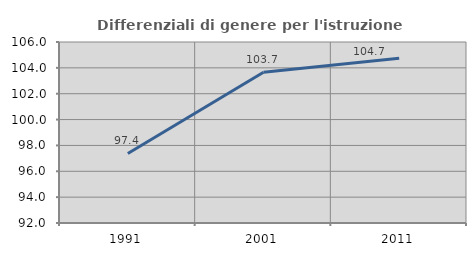
| Category | Differenziali di genere per l'istruzione superiore |
|---|---|
| 1991.0 | 97.379 |
| 2001.0 | 103.664 |
| 2011.0 | 104.735 |